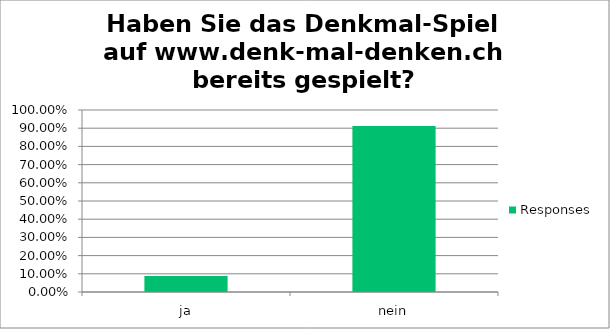
| Category | Responses |
|---|---|
| ja | 0.088 |
| nein | 0.912 |